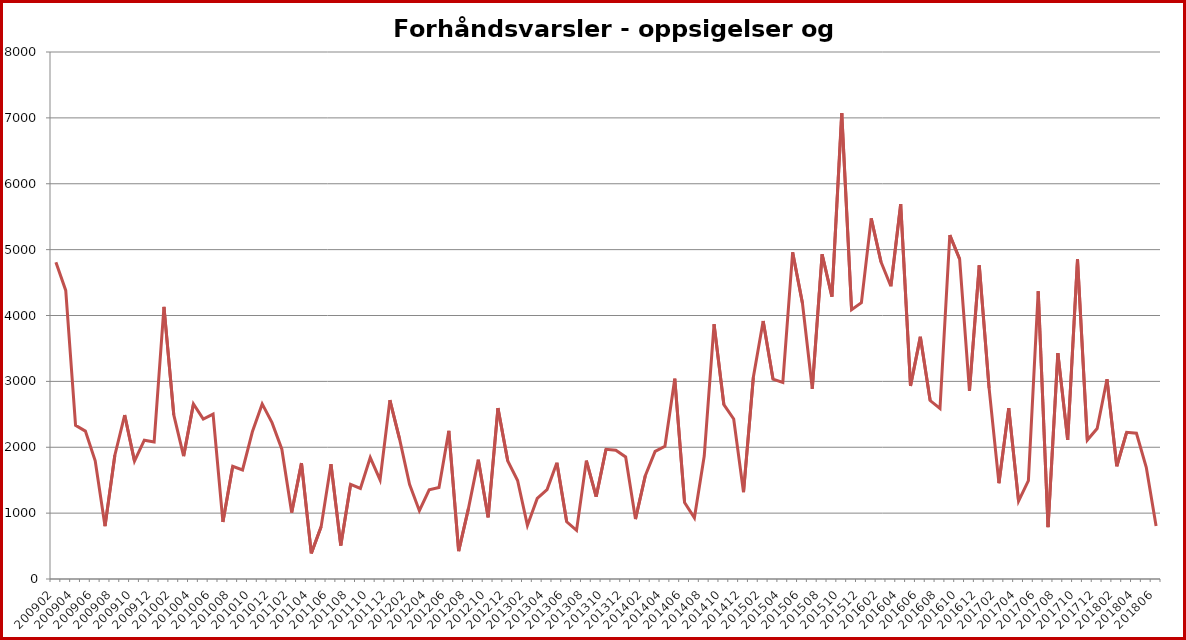
| Category | Series 1 |
|---|---|
| 200902.0 | 4810 |
| 200903.0 | 4381 |
| 200904.0 | 2332 |
| 200905.0 | 2245 |
| 200906.0 | 1794 |
| 200907.0 | 802 |
| 200908.0 | 1879 |
| 200909.0 | 2489 |
| 200910.0 | 1789 |
| 200911.0 | 2107 |
| 200912.0 | 2080 |
| 201001.0 | 4130 |
| 201002.0 | 2490 |
| 201003.0 | 1865 |
| 201004.0 | 2658 |
| 201005.0 | 2427 |
| 201006.0 | 2503 |
| 201007.0 | 866 |
| 201008.0 | 1711 |
| 201009.0 | 1655 |
| 201010.0 | 2235 |
| 201011.0 | 2658 |
| 201012.0 | 2374 |
| 201101.0 | 1971 |
| 201102.0 | 1008 |
| 201103.0 | 1759 |
| 201104.0 | 389 |
| 201105.0 | 794 |
| 201106.0 | 1744 |
| 201107.0 | 509 |
| 201108.0 | 1436 |
| 201109.0 | 1374 |
| 201110.0 | 1844 |
| 201111.0 | 1504 |
| 201112.0 | 2714 |
| 201201.0 | 2115 |
| 201202.0 | 1437 |
| 201203.0 | 1037 |
| 201204.0 | 1355 |
| 201205.0 | 1390 |
| 201206.0 | 2249 |
| 201207.0 | 423 |
| 201208.0 | 1073 |
| 201209.0 | 1812 |
| 201210.0 | 937 |
| 201211.0 | 2594 |
| 201212.0 | 1792 |
| 201301.0 | 1496 |
| 201302.0 | 813 |
| 201303.0 | 1223 |
| 201304.0 | 1358 |
| 201305.0 | 1765 |
| 201306.0 | 869 |
| 201307.0 | 738 |
| 201308.0 | 1797 |
| 201309.0 | 1250 |
| 201310.0 | 1969 |
| 201311.0 | 1954 |
| 201312.0 | 1853 |
| 201401.0 | 910 |
| 201402.0 | 1568 |
| 201403.0 | 1937 |
| 201404.0 | 2014 |
| 201405.0 | 3040 |
| 201406.0 | 1160 |
| 201407.0 | 929 |
| 201408.0 | 1866 |
| 201409.0 | 3868 |
| 201410.0 | 2646 |
| 201411.0 | 2429 |
| 201412.0 | 1317 |
| 201501.0 | 3062 |
| 201502.0 | 3915 |
| 201503.0 | 3035 |
| 201504.0 | 2985 |
| 201505.0 | 4960 |
| 201506.0 | 4185 |
| 201507.0 | 2888 |
| 201508.0 | 4930 |
| 201509.0 | 4286 |
| 201510.0 | 7072 |
| 201511.0 | 4087 |
| 201512.0 | 4193 |
| 201601.0 | 5475 |
| 201602.0 | 4812 |
| 201603.0 | 4444 |
| 201604.0 | 5691 |
| 201605.0 | 2931 |
| 201606.0 | 3676 |
| 201607.0 | 2709 |
| 201608.0 | 2588 |
| 201609.0 | 5220 |
| 201610.0 | 4857 |
| 201611.0 | 2855 |
| 201612.0 | 4761 |
| 201701.0 | 2898 |
| 201702.0 | 1454 |
| 201703.0 | 2594 |
| 201704.0 | 1182 |
| 201705.0 | 1494 |
| 201706.0 | 4368 |
| 201707.0 | 787 |
| 201708.0 | 3429 |
| 201709.0 | 2112 |
| 201710.0 | 4854 |
| 201711.0 | 2109 |
| 201712.0 | 2284 |
| 201801.0 | 3032 |
| 201802.0 | 1711 |
| 201803.0 | 2227 |
| 201804.0 | 2213 |
| 201805.0 | 1696 |
| 201806.0 | 805 |